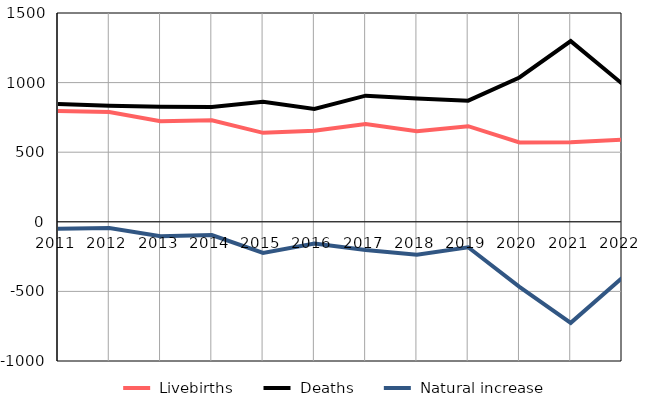
| Category |  Livebirths |  Deaths |  Natural increase |
|---|---|---|---|
| 2011.0 | 796 | 846 | -50 |
| 2012.0 | 789 | 833 | -44 |
| 2013.0 | 722 | 826 | -104 |
| 2014.0 | 730 | 825 | -95 |
| 2015.0 | 639 | 863 | -224 |
| 2016.0 | 654 | 810 | -156 |
| 2017.0 | 703 | 906 | -203 |
| 2018.0 | 650 | 886 | -236 |
| 2019.0 | 687 | 870 | -183 |
| 2020.0 | 570 | 1037 | -467 |
| 2021.0 | 572 | 1298 | -726 |
| 2022.0 | 589 | 993 | -404 |